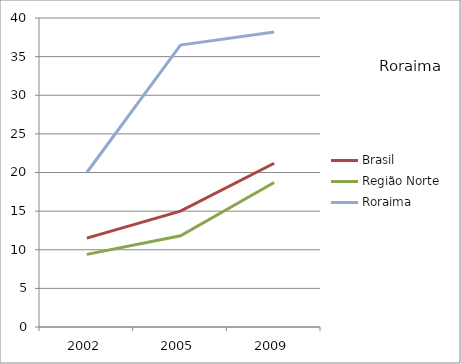
| Category | Brasil | Região Norte | Roraima |
|---|---|---|---|
| 2002.0 | 11.5 | 9.4 | 20 |
| 2005.0 | 15 | 11.8 | 36.5 |
| 2009.0 | 21.2 | 18.7 | 38.2 |